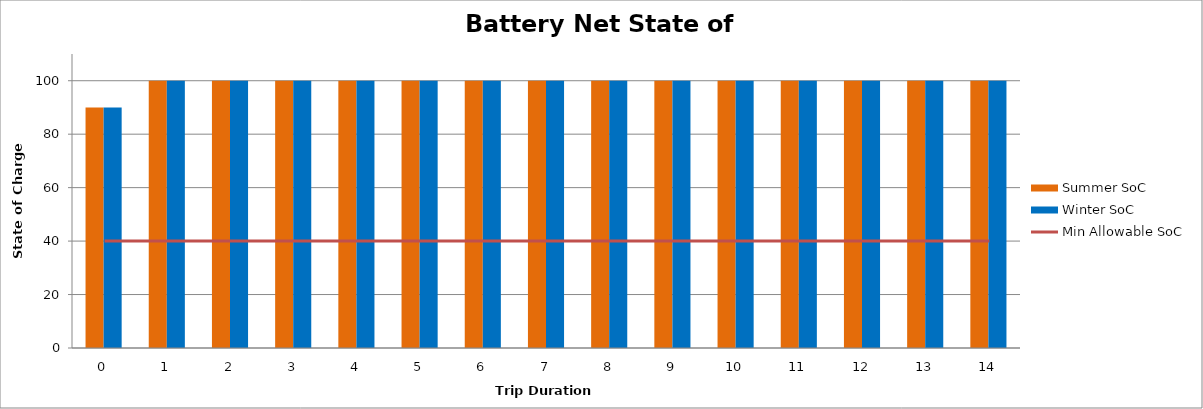
| Category | Summer SoC | Winter SoC |
|---|---|---|
| 0.0 | 90 | 90 |
| 1.0 | 100 | 100 |
| 2.0 | 100 | 100 |
| 3.0 | 100 | 100 |
| 4.0 | 100 | 100 |
| 5.0 | 100 | 100 |
| 6.0 | 100 | 100 |
| 7.0 | 100 | 100 |
| 8.0 | 100 | 100 |
| 9.0 | 100 | 100 |
| 10.0 | 100 | 100 |
| 11.0 | 100 | 100 |
| 12.0 | 100 | 100 |
| 13.0 | 100 | 100 |
| 14.0 | 100 | 100 |